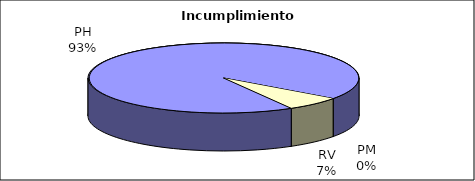
| Category | Efectivo |
|---|---|
| PH | 14 |
| PM | 0 |
| RV | 1 |